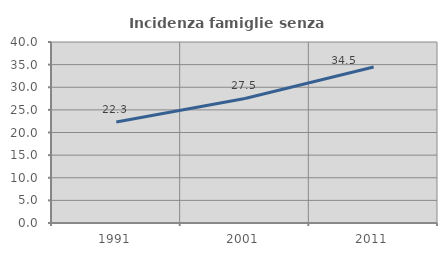
| Category | Incidenza famiglie senza nuclei |
|---|---|
| 1991.0 | 22.3 |
| 2001.0 | 27.529 |
| 2011.0 | 34.465 |